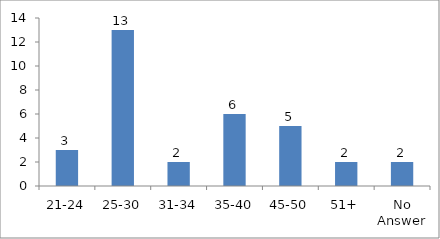
| Category | Age |
|---|---|
| 21-24 | 3 |
| 25-30 | 13 |
| 31-34 | 2 |
| 35-40 | 6 |
| 45-50 | 5 |
| 51+ | 2 |
| No Answer | 2 |